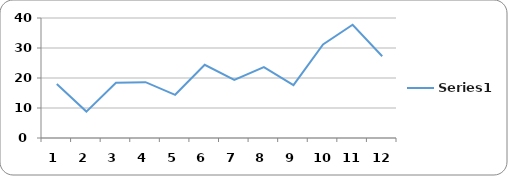
| Category | Series 0 |
|---|---|
| 0 | 18 |
| 1 | 8.8 |
| 2 | 18.4 |
| 3 | 18.6 |
| 4 | 14.4 |
| 5 | 24.4 |
| 6 | 19.4 |
| 7 | 23.6 |
| 8 | 17.6 |
| 9 | 31.2 |
| 10 | 37.75 |
| 11 | 27.25 |